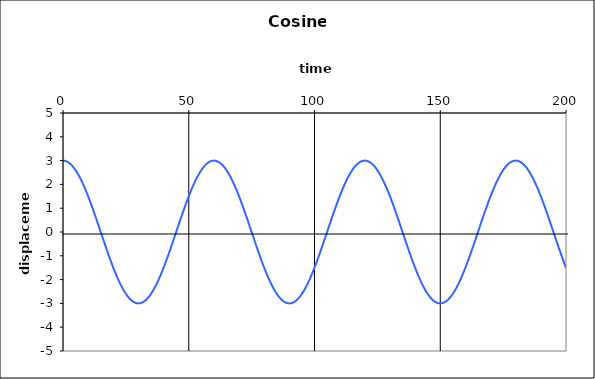
| Category | Cosine |
|---|---|
| 0.0 | 3 |
| 1.0 | 2.984 |
| 2.0 | 2.934 |
| 3.0 | 2.853 |
| 4.0 | 2.741 |
| 5.0 | 2.598 |
| 6.0 | 2.427 |
| 7.0 | 2.229 |
| 8.0 | 2.007 |
| 9.0 | 1.763 |
| 10.0 | 1.5 |
| 11.0 | 1.22 |
| 12.0 | 0.927 |
| 13.0 | 0.624 |
| 14.0 | 0.314 |
| 15.0 | 0 |
| 16.0 | -0.314 |
| 17.0 | -0.624 |
| 18.0 | -0.927 |
| 19.0 | -1.22 |
| 20.0 | -1.5 |
| 21.0 | -1.763 |
| 22.0 | -2.007 |
| 23.0 | -2.229 |
| 24.0 | -2.427 |
| 25.0 | -2.598 |
| 26.0 | -2.741 |
| 27.0 | -2.853 |
| 28.0 | -2.934 |
| 29.0 | -2.984 |
| 30.0 | -3 |
| 31.0 | -2.984 |
| 32.0 | -2.934 |
| 33.0 | -2.853 |
| 34.0 | -2.741 |
| 35.0 | -2.598 |
| 36.0 | -2.427 |
| 37.0 | -2.229 |
| 38.0 | -2.007 |
| 39.0 | -1.763 |
| 40.0 | -1.5 |
| 41.0 | -1.22 |
| 42.0 | -0.927 |
| 43.0 | -0.624 |
| 44.0 | -0.314 |
| 45.0 | 0 |
| 46.0 | 0.314 |
| 47.0 | 0.624 |
| 48.0 | 0.927 |
| 49.0 | 1.22 |
| 50.0 | 1.5 |
| 51.0 | 1.763 |
| 52.0 | 2.007 |
| 53.0 | 2.229 |
| 54.0 | 2.427 |
| 55.0 | 2.598 |
| 56.0 | 2.741 |
| 57.0 | 2.853 |
| 58.0 | 2.934 |
| 59.0 | 2.984 |
| 60.0 | 3 |
| 61.0 | 2.984 |
| 62.0 | 2.934 |
| 63.0 | 2.853 |
| 64.0 | 2.741 |
| 65.0 | 2.598 |
| 66.0 | 2.427 |
| 67.0 | 2.229 |
| 68.0 | 2.007 |
| 69.0 | 1.763 |
| 70.0 | 1.5 |
| 71.0 | 1.22 |
| 72.0 | 0.927 |
| 73.0 | 0.624 |
| 74.0 | 0.314 |
| 75.0 | 0 |
| 76.0 | -0.314 |
| 77.0 | -0.624 |
| 78.0 | -0.927 |
| 79.0 | -1.22 |
| 80.0 | -1.5 |
| 81.0 | -1.763 |
| 82.0 | -2.007 |
| 83.0 | -2.229 |
| 84.0 | -2.427 |
| 85.0 | -2.598 |
| 86.0 | -2.741 |
| 87.0 | -2.853 |
| 88.0 | -2.934 |
| 89.0 | -2.984 |
| 90.0 | -3 |
| 91.0 | -2.984 |
| 92.0 | -2.934 |
| 93.0 | -2.853 |
| 94.0 | -2.741 |
| 95.0 | -2.598 |
| 96.0 | -2.427 |
| 97.0 | -2.229 |
| 98.0 | -2.007 |
| 99.0 | -1.763 |
| 100.0 | -1.5 |
| 101.0 | -1.22 |
| 102.0 | -0.927 |
| 103.0 | -0.624 |
| 104.0 | -0.314 |
| 105.0 | 0 |
| 106.0 | 0.314 |
| 107.0 | 0.624 |
| 108.0 | 0.927 |
| 109.0 | 1.22 |
| 110.0 | 1.5 |
| 111.0 | 1.763 |
| 112.0 | 2.007 |
| 113.0 | 2.229 |
| 114.0 | 2.427 |
| 115.0 | 2.598 |
| 116.0 | 2.741 |
| 117.0 | 2.853 |
| 118.0 | 2.934 |
| 119.0 | 2.984 |
| 120.0 | 3 |
| 121.0 | 2.984 |
| 122.0 | 2.934 |
| 123.0 | 2.853 |
| 124.0 | 2.741 |
| 125.0 | 2.598 |
| 126.0 | 2.427 |
| 127.0 | 2.229 |
| 128.0 | 2.007 |
| 129.0 | 1.763 |
| 130.0 | 1.5 |
| 131.0 | 1.22 |
| 132.0 | 0.927 |
| 133.0 | 0.624 |
| 134.0 | 0.314 |
| 135.0 | 0 |
| 136.0 | -0.314 |
| 137.0 | -0.624 |
| 138.0 | -0.927 |
| 139.0 | -1.22 |
| 140.0 | -1.5 |
| 141.0 | -1.763 |
| 142.0 | -2.007 |
| 143.0 | -2.229 |
| 144.0 | -2.427 |
| 145.0 | -2.598 |
| 146.0 | -2.741 |
| 147.0 | -2.853 |
| 148.0 | -2.934 |
| 149.0 | -2.984 |
| 150.0 | -3 |
| 151.0 | -2.984 |
| 152.0 | -2.934 |
| 153.0 | -2.853 |
| 154.0 | -2.741 |
| 155.0 | -2.598 |
| 156.0 | -2.427 |
| 157.0 | -2.229 |
| 158.0 | -2.007 |
| 159.0 | -1.763 |
| 160.0 | -1.5 |
| 161.0 | -1.22 |
| 162.0 | -0.927 |
| 163.0 | -0.624 |
| 164.0 | -0.314 |
| 165.0 | 0 |
| 166.0 | 0.314 |
| 167.0 | 0.624 |
| 168.0 | 0.927 |
| 169.0 | 1.22 |
| 170.0 | 1.5 |
| 171.0 | 1.763 |
| 172.0 | 2.007 |
| 173.0 | 2.229 |
| 174.0 | 2.427 |
| 175.0 | 2.598 |
| 176.0 | 2.741 |
| 177.0 | 2.853 |
| 178.0 | 2.934 |
| 179.0 | 2.984 |
| 180.0 | 3 |
| 181.0 | 2.984 |
| 182.0 | 2.934 |
| 183.0 | 2.853 |
| 184.0 | 2.741 |
| 185.0 | 2.598 |
| 186.0 | 2.427 |
| 187.0 | 2.229 |
| 188.0 | 2.007 |
| 189.0 | 1.763 |
| 190.0 | 1.5 |
| 191.0 | 1.22 |
| 192.0 | 0.927 |
| 193.0 | 0.624 |
| 194.0 | 0.314 |
| 195.0 | 0 |
| 196.0 | -0.314 |
| 197.0 | -0.624 |
| 198.0 | -0.927 |
| 199.0 | -1.22 |
| 200.0 | -1.5 |